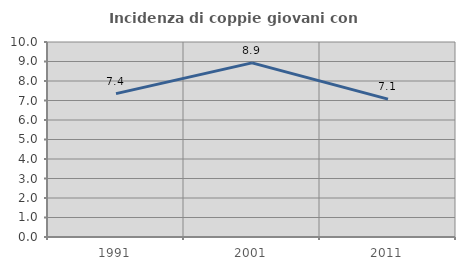
| Category | Incidenza di coppie giovani con figli |
|---|---|
| 1991.0 | 7.353 |
| 2001.0 | 8.929 |
| 2011.0 | 7.071 |